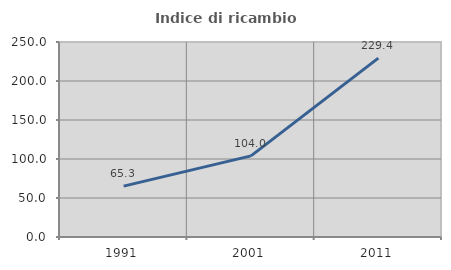
| Category | Indice di ricambio occupazionale  |
|---|---|
| 1991.0 | 65.267 |
| 2001.0 | 103.988 |
| 2011.0 | 229.388 |